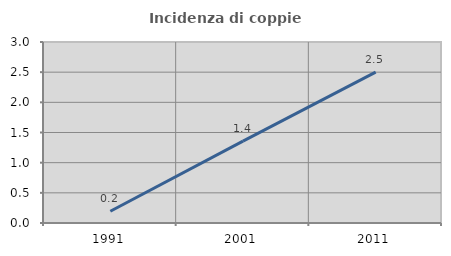
| Category | Incidenza di coppie miste |
|---|---|
| 1991.0 | 0.195 |
| 2001.0 | 1.357 |
| 2011.0 | 2.5 |